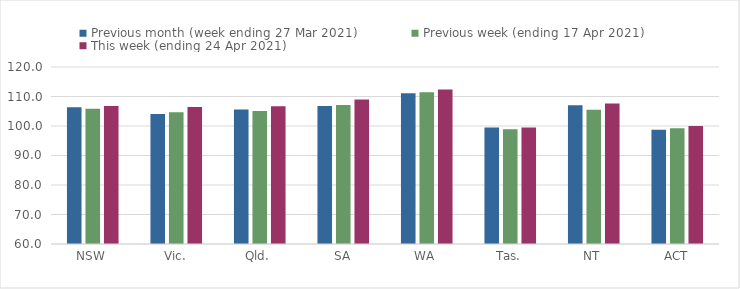
| Category | Previous month (week ending 27 Mar 2021) | Previous week (ending 17 Apr 2021) | This week (ending 24 Apr 2021) |
|---|---|---|---|
| NSW | 106.35 | 105.84 | 106.75 |
| Vic. | 104.09 | 104.64 | 106.41 |
| Qld. | 105.6 | 105.12 | 106.66 |
| SA | 106.74 | 107.15 | 108.97 |
| WA | 111.06 | 111.45 | 112.41 |
| Tas. | 99.46 | 98.86 | 99.52 |
| NT | 107.05 | 105.5 | 107.61 |
| ACT | 98.74 | 99.27 | 100.03 |